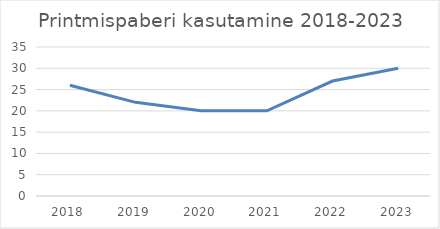
| Category | Series 0 |
|---|---|
| 2018.0 | 26 |
| 2019.0 | 22 |
| 2020.0 | 20 |
| 2021.0 | 20 |
| 2022.0 | 27 |
| 2023.0 | 30 |